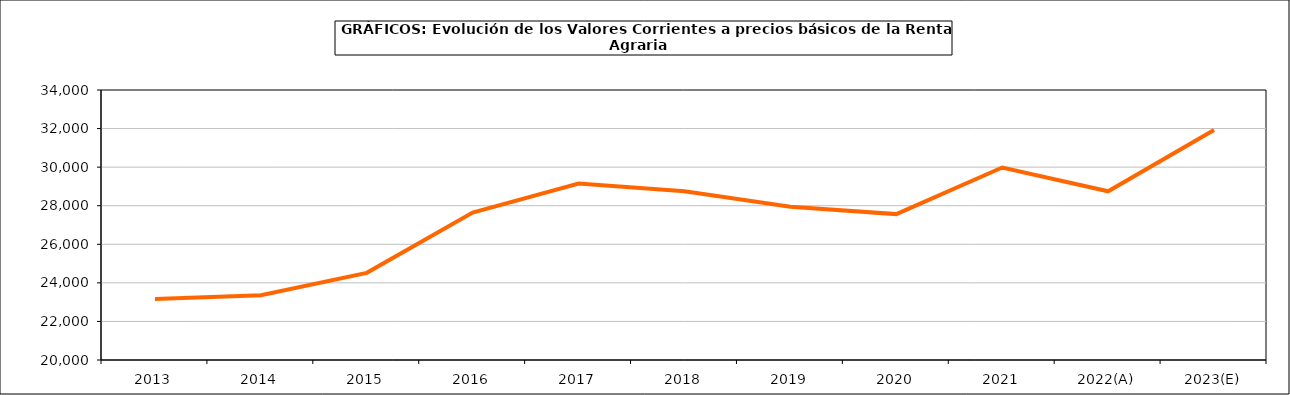
| Category | renta agraria |
|---|---|
| 2013 | 23161.5 |
| 2014 | 23361.1 |
| 2015 | 24518.8 |
| 2016 | 27646.8 |
| 2017 | 29152.2 |
| 2018 | 28755.3 |
| 2019 | 27946.4 |
| 2020 | 27565.1 |
| 2021 | 29980.3 |
| 2022(A) | 28746.9 |
| 2023(E) | 31931.3 |